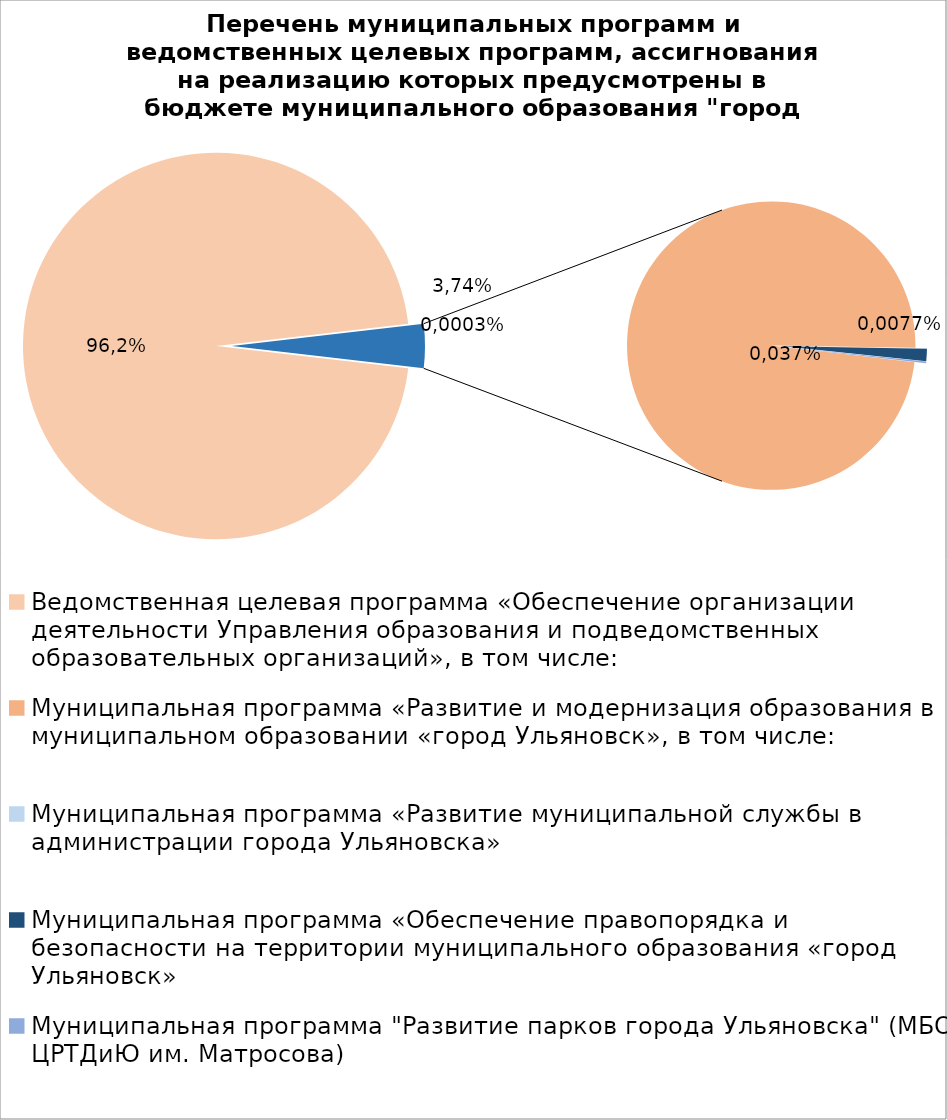
| Category | Series 0 |
|---|---|
| Ведомственная целевая программа «Обеспечение организации деятельности Управления образования и подведомственных образовательных организаций», в том числе: | 5102944.17 |
| Муниципальная программа «Развитие и модернизация образования в муниципальном образовании «город Ульяновск», в том числе: | 192031.6 |
| Муниципальная программа «Развитие муниципальной службы в администрации города Ульяновска» | 15.4 |
| Муниципальная программа «Обеспечение правопорядка и безопасности на территории муниципального образования «город Ульяновск» | 2700 |
| Муниципальная программа "Развитие парков города Ульяновска" (МБОУ ЦРТДиЮ им. Матросова) | 400 |